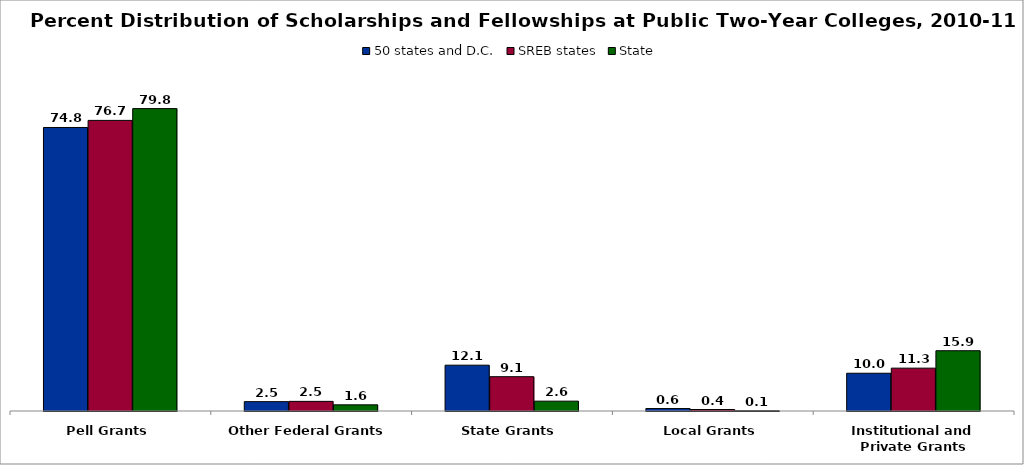
| Category | 50 states and D.C. | SREB states | State |
|---|---|---|---|
| Pell Grants | 74.832 | 76.698 | 79.809 |
| Other Federal Grants | 2.467 | 2.542 | 1.628 |
| State Grants | 12.091 | 9.053 | 2.599 |
| Local Grants | 0.644 | 0.396 | 0.056 |
| Institutional and Private Grants | 9.966 | 11.311 | 15.909 |